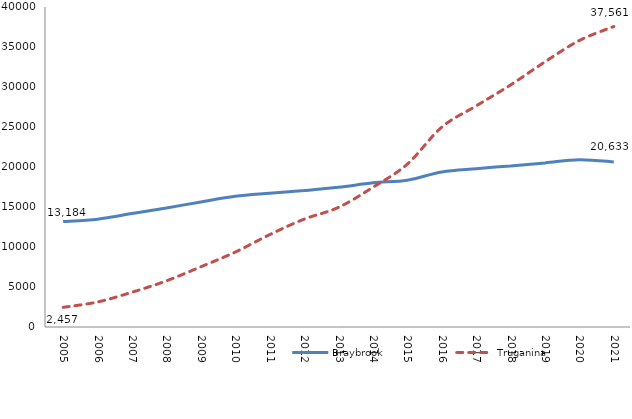
| Category | Braybrook | Truganina |
|---|---|---|
| 2005.0 | 13184 | 2457 |
| 2006.0 | 13482 | 3128 |
| 2007.0 | 14178 | 4347 |
| 2008.0 | 14881 | 5770 |
| 2009.0 | 15633 | 7527 |
| 2010.0 | 16343 | 9365 |
| 2011.0 | 16719 | 11544 |
| 2012.0 | 17055 | 13481 |
| 2013.0 | 17456 | 14954 |
| 2014.0 | 18029 | 17463 |
| 2015.0 | 18351 | 20359 |
| 2016.0 | 19384 | 24977 |
| 2017.0 | 19795 | 27633 |
| 2018.0 | 20138 | 30256 |
| 2019.0 | 20514 | 33144 |
| 2020.0 | 20914 | 35816 |
| 2021.0 | 20633 | 37561 |